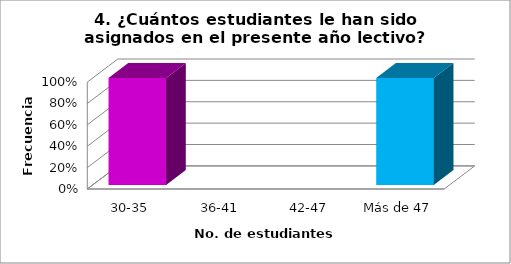
| Category | Series 0 |
|---|---|
| 30-35 | 0.4 |
| 36-41 | 0 |
| 42-47 | 0 |
| Más de 47 | 0.4 |